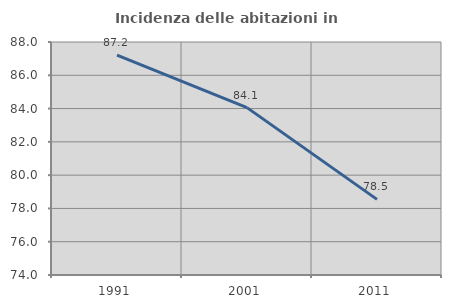
| Category | Incidenza delle abitazioni in proprietà  |
|---|---|
| 1991.0 | 87.209 |
| 2001.0 | 84.058 |
| 2011.0 | 78.545 |